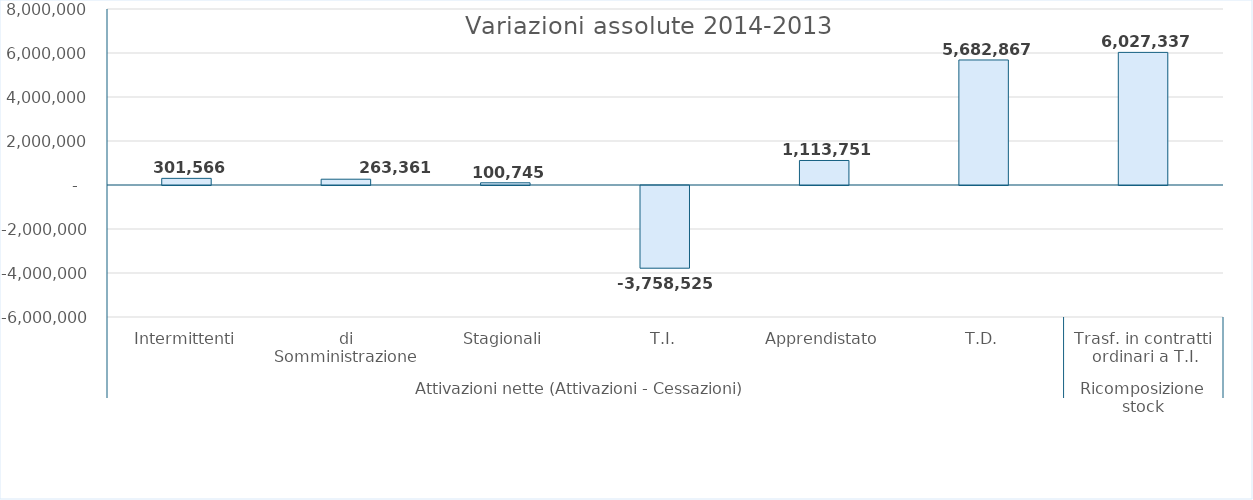
| Category | Cumulata 2014-2022 |
|---|---|
| 0 | 301566 |
| 1 | 263361 |
| 2 | 100745 |
| 3 | -3758525 |
| 4 | 1113751 |
| 5 | 5682867 |
| 6 | 6027337 |